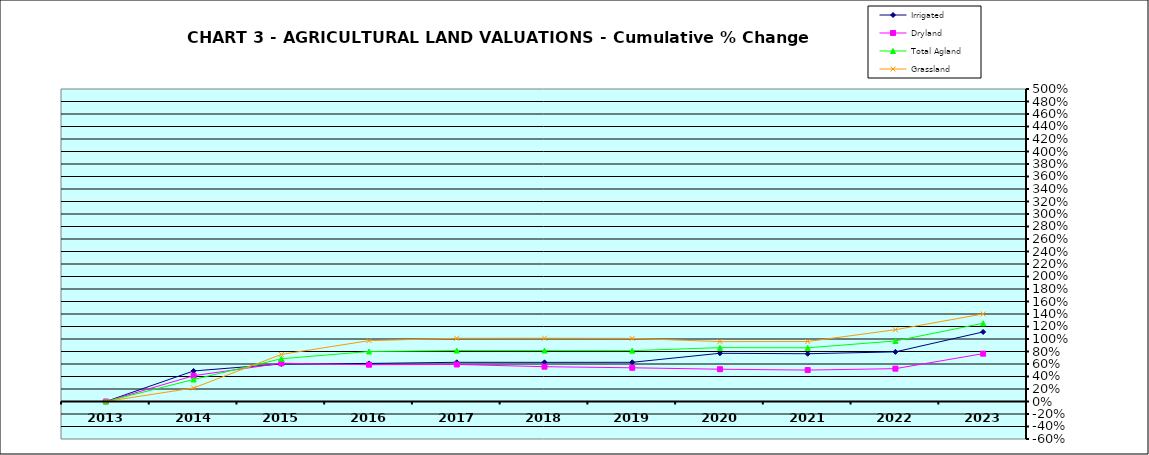
| Category | Irrigated | Dryland | Total Agland | Grassland |
|---|---|---|---|---|
| 2013.0 | 0 | 0 | 0 | 0 |
| 2014.0 | 0.489 | 0.413 | 0.352 | 0.216 |
| 2015.0 | 0.6 | 0.612 | 0.684 | 0.753 |
| 2016.0 | 0.609 | 0.589 | 0.8 | 0.973 |
| 2017.0 | 0.627 | 0.592 | 0.815 | 1.012 |
| 2018.0 | 0.627 | 0.557 | 0.815 | 1.012 |
| 2019.0 | 0.627 | 0.539 | 0.814 | 1.01 |
| 2020.0 | 0.772 | 0.516 | 0.862 | 0.958 |
| 2021.0 | 0.764 | 0.503 | 0.859 | 0.96 |
| 2022.0 | 0.794 | 0.525 | 0.969 | 1.148 |
| 2023.0 | 1.113 | 0.766 | 1.252 | 1.4 |